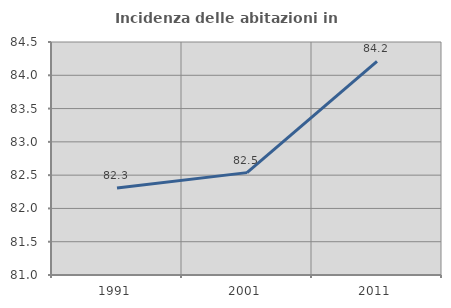
| Category | Incidenza delle abitazioni in proprietà  |
|---|---|
| 1991.0 | 82.308 |
| 2001.0 | 82.538 |
| 2011.0 | 84.211 |